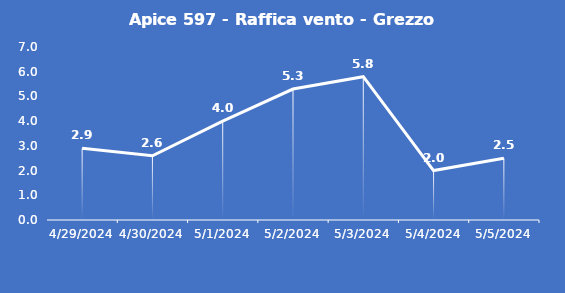
| Category | Apice 597 - Raffica vento - Grezzo (m/s) |
|---|---|
| 4/29/24 | 2.9 |
| 4/30/24 | 2.6 |
| 5/1/24 | 4 |
| 5/2/24 | 5.3 |
| 5/3/24 | 5.8 |
| 5/4/24 | 2 |
| 5/5/24 | 2.5 |